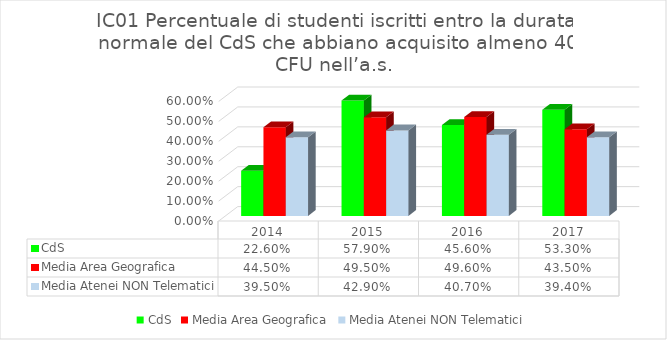
| Category | CdS | Media Area Geografica | Media Atenei NON Telematici |
|---|---|---|---|
| 2014.0 | 0.226 | 0.445 | 0.395 |
| 2015.0 | 0.579 | 0.495 | 0.429 |
| 2016.0 | 0.456 | 0.496 | 0.407 |
| 2017.0 | 0.533 | 0.435 | 0.394 |